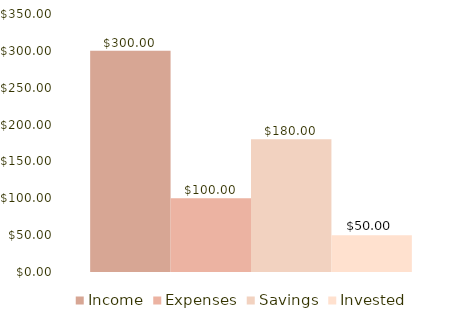
| Category | Income | Expenses | Savings | Invested |
|---|---|---|---|---|
| 0 | 300 | 100 | 180 | 50 |